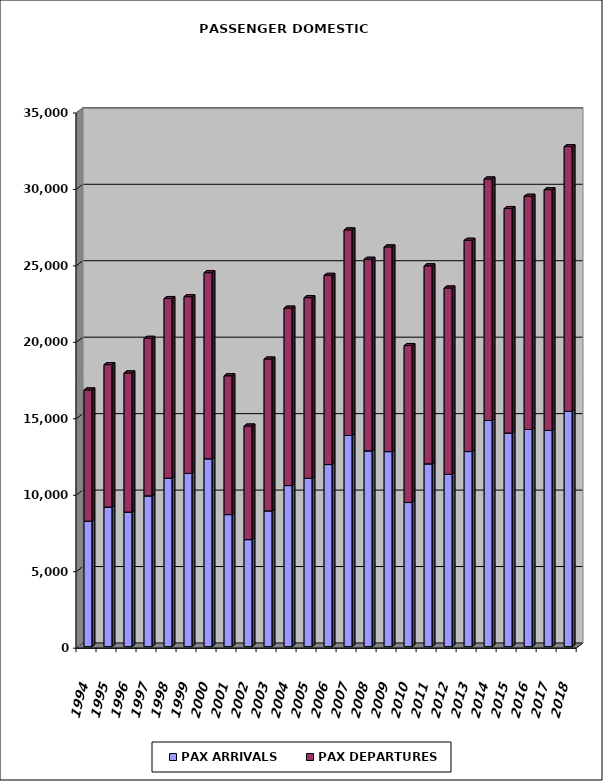
| Category | PAX ARRIVALS | PAX DEPARTURES |
|---|---|---|
| 1994.0 | 8205 | 8582 |
| 1995.0 | 9126 | 9317 |
| 1996.0 | 8802 | 9095 |
| 1997.0 | 9859 | 10302 |
| 1998.0 | 11018 | 11747 |
| 1999.0 | 11330 | 11559 |
| 2000.0 | 12285 | 12170 |
| 2001.0 | 8635 | 9078 |
| 2002.0 | 6999 | 7426 |
| 2003.0 | 8877 | 9929 |
| 2004.0 | 10533 | 11603 |
| 2005.0 | 11013 | 11809 |
| 2006.0 | 11908 | 12372 |
| 2007.0 | 13810 | 13440 |
| 2008.0 | 12803 | 12530 |
| 2009.0 | 12755 | 13385 |
| 2010.0 | 9424 | 10266 |
| 2011.0 | 11953 | 12953 |
| 2012.0 | 11271 | 12183 |
| 2013.0 | 12758 | 13816 |
| 2014.0 | 14788 | 15795 |
| 2015.0 | 13969 | 14682 |
| 2016.0 | 14203 | 15250 |
| 2017.0 | 14139 | 15745 |
| 2018.0 | 15385 | 17319 |